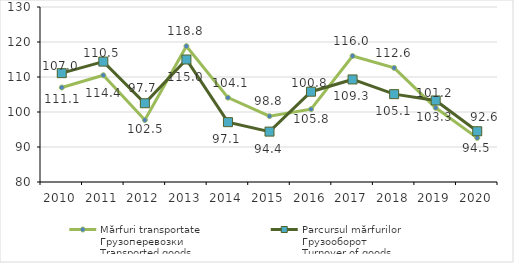
| Category | Mărfuri transportate
Грузоперевозки
Transported goods | Parcursul mărfurilor
Грузооборот
Turnover of goods |
|---|---|---|
| 2010.0 | 107 | 111.1 |
| 2011.0 | 110.5 | 114.4 |
| 2012.0 | 97.7 | 102.5 |
| 2013.0 | 118.8 | 115 |
| 2014.0 | 104.1 | 97.1 |
| 2015.0 | 98.8 | 94.4 |
| 2016.0 | 100.8 | 105.8 |
| 2017.0 | 116 | 109.3 |
| 2018.0 | 112.6 | 105.1 |
| 2019.0 | 101.2 | 103.3 |
| 2020.0 | 92.6 | 94.5 |